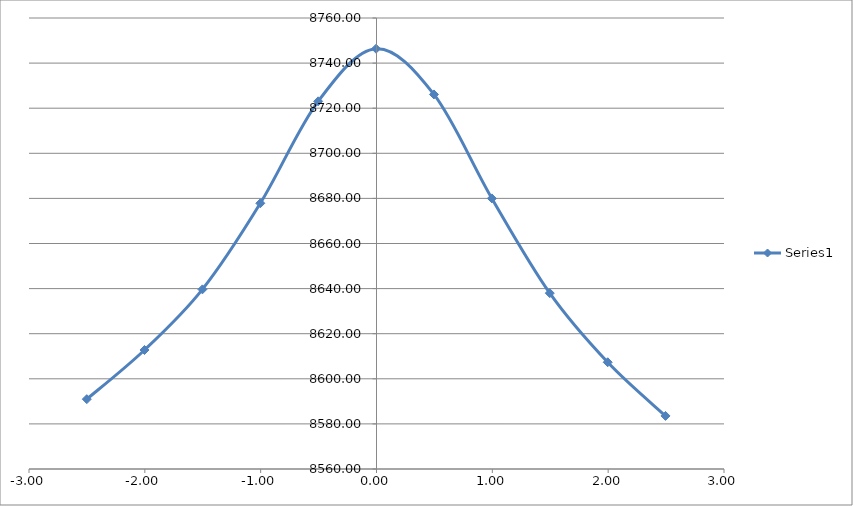
| Category | Series 0 |
|---|---|
| -2.5010000000000003 | 8590.967 |
| -2.003 | 8612.772 |
| -1.5030000000000001 | 8639.659 |
| -1.0030000000000001 | 8677.84 |
| -0.5040000000000004 | 8723.035 |
| -0.004000000000000448 | 8746.368 |
| 0.49599999999999955 | 8726.101 |
| 0.9959999999999996 | 8679.997 |
| 1.4959999999999996 | 8637.983 |
| 1.9959999999999996 | 8607.333 |
| 2.495 | 8583.532 |